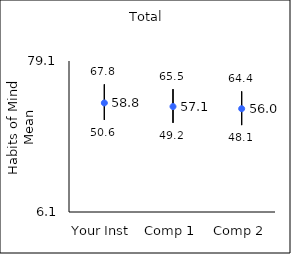
| Category | 25th percentile | 75th percentile | Mean |
|---|---|---|---|
| Your Inst | 50.6 | 67.8 | 58.82 |
| Comp 1 | 49.2 | 65.5 | 57.08 |
| Comp 2 | 48.1 | 64.4 | 56.04 |